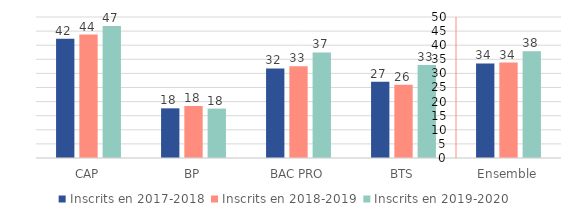
| Category | Inscrits en 2017-2018 | Inscrits en 2018-2019 | Inscrits en 2019-2020 |
|---|---|---|---|
| CAP | 42.29 | 43.77 | 46.83 |
| BP | 17.61 | 18.45 | 17.52 |
| BAC PRO | 31.77 | 32.55 | 37.43 |
| BTS | 27.02 | 25.96 | 32.98 |
| Ensemble | 33.54 | 33.831 | 37.857 |